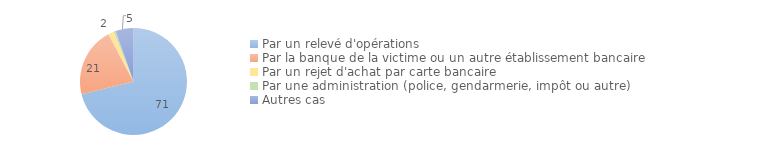
| Category | Series 0 |
|---|---|
| Par un relevé d'opérations | 71.133 |
| Par la banque de la victime ou un autre établissement bancaire | 21.119 |
| Par un rejet d'achat par carte bancaire | 1.733 |
| Par une administration (police, gendarmerie, impôt ou autre) | 0.58 |
| Autres cas | 5.436 |